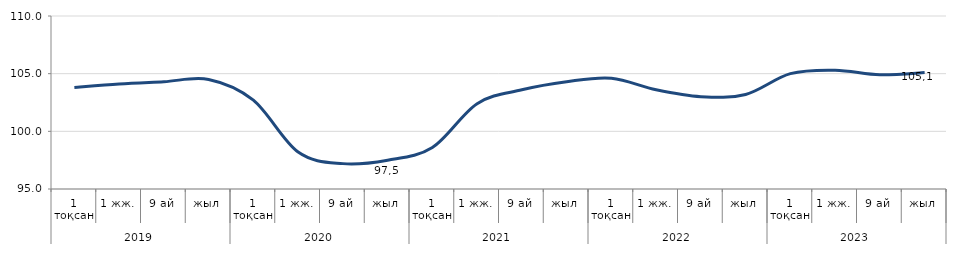
| Category | Series 0 |
|---|---|
| 0 | 103.8 |
| 1 | 104.1 |
| 2 | 104.3 |
| 3 | 104.5 |
| 4 | 102.7 |
| 5 | 98.2 |
| 6 | 97.2 |
| 7 | 97.5 |
| 8 | 98.6 |
| 9 | 102.4 |
| 10 | 103.6 |
| 11 | 104.3 |
| 12 | 104.6 |
| 13 | 103.6 |
| 14 | 103 |
| 15 | 103.2 |
| 16 | 105 |
| 17 | 105.3 |
| 18 | 104.9 |
| 19 | 105.1 |